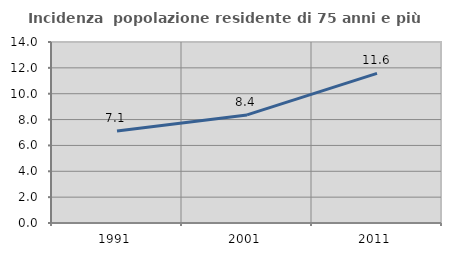
| Category | Incidenza  popolazione residente di 75 anni e più |
|---|---|
| 1991.0 | 7.122 |
| 2001.0 | 8.358 |
| 2011.0 | 11.574 |